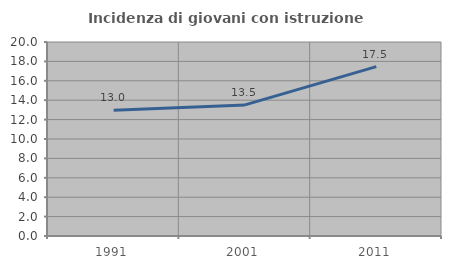
| Category | Incidenza di giovani con istruzione universitaria |
|---|---|
| 1991.0 | 12.963 |
| 2001.0 | 13.514 |
| 2011.0 | 17.46 |